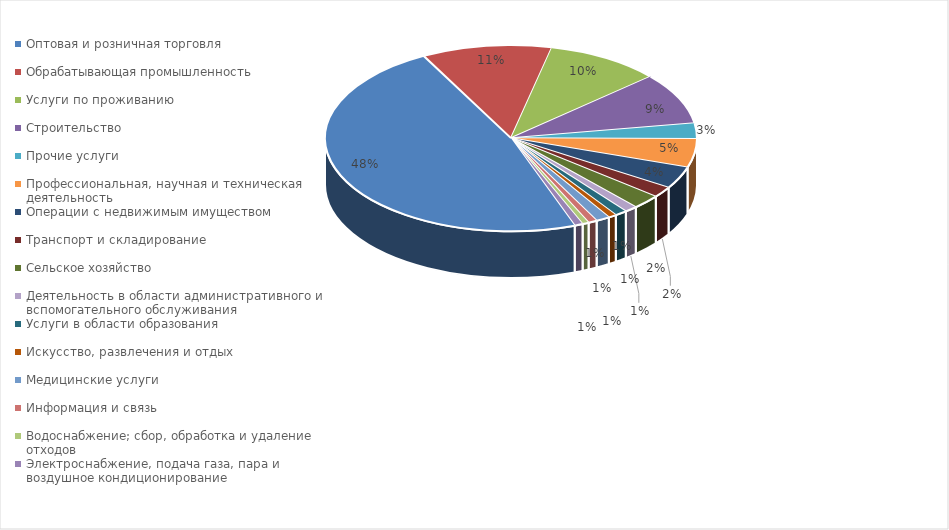
| Category | Series 0 |
|---|---|
| Оптовая и розничная торговля | 0.478 |
| Обрабатывающая промышленность | 0.113 |
| Услуги по проживанию | 0.1 |
| Строительство | 0.089 |
| Прочие услуги | 0.027 |
| Профессиональная, научная и техническая деятельность | 0.05 |
| Операции с недвижимым имуществом | 0.038 |
| Транспорт и складирование | 0.019 |
| Сельское хозяйство | 0.025 |
| Деятельность в области административного и вспомогательного обслуживания | 0.011 |
| Услуги в области образования | 0.011 |
| Искусство, развлечения и отдых | 0.007 |
| Медицинские услуги | 0.012 |
| Информация и связь | 0.008 |
| Водоснабжение; сбор, обработка и удаление отходов | 0.006 |
| Электроснабжение, подача газа, пара и воздушное кондиционирование | 0.007 |